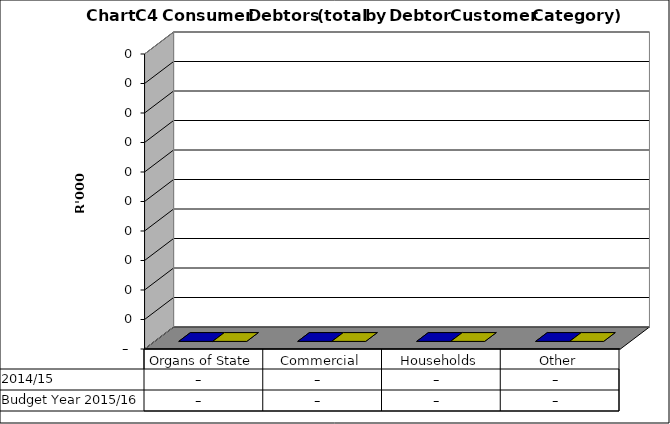
| Category |  2014/15  | Budget Year 2015/16 |
|---|---|---|
| Organs of State | 0 | 0 |
| Commercial | 0 | 0 |
| Households | 0 | 0 |
| Other | 0 | 0 |